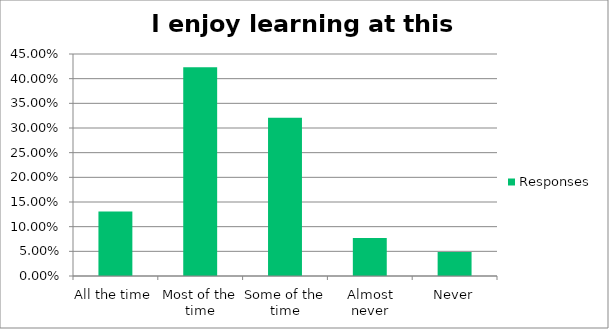
| Category | Responses |
|---|---|
| All the time | 0.131 |
| Most of the time | 0.423 |
| Some of the time | 0.321 |
| Almost never | 0.077 |
| Never | 0.048 |